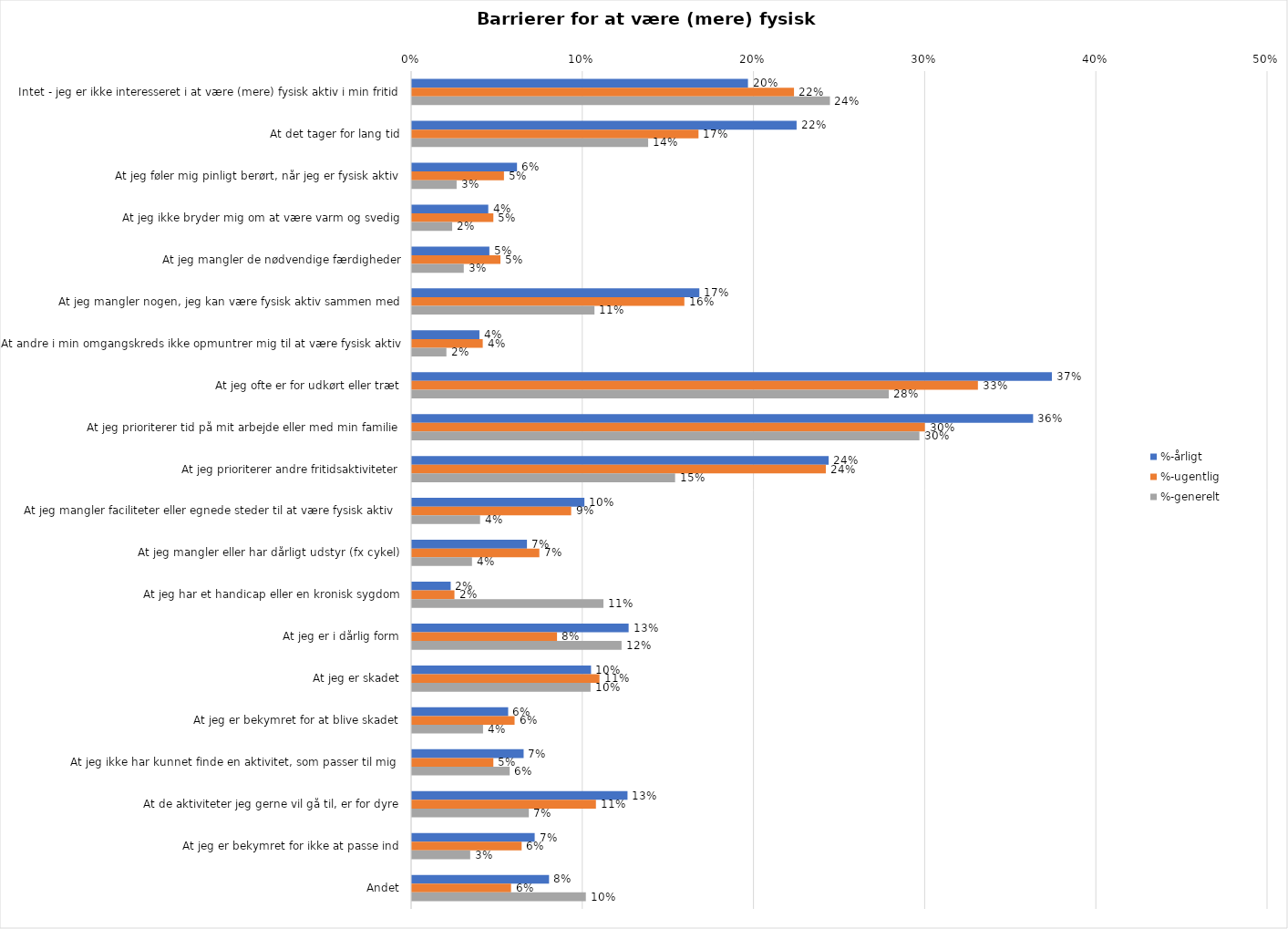
| Category | %-årligt | %-ugentlig | %-generelt |
|---|---|---|---|
| Intet - jeg er ikke interesseret i at være (mere) fysisk aktiv i min fritid | 0.196 | 0.223 | 0.244 |
| At det tager for lang tid | 0.225 | 0.167 | 0.138 |
| At jeg føler mig pinligt berørt, når jeg er fysisk aktiv | 0.061 | 0.054 | 0.026 |
| At jeg ikke bryder mig om at være varm og svedig | 0.045 | 0.048 | 0.023 |
| At jeg mangler de nødvendige færdigheder | 0.045 | 0.052 | 0.03 |
| At jeg mangler nogen, jeg kan være fysisk aktiv sammen med | 0.168 | 0.159 | 0.107 |
| At andre i min omgangskreds ikke opmuntrer mig til at være fysisk aktiv | 0.039 | 0.041 | 0.02 |
| At jeg ofte er for udkørt eller træt | 0.374 | 0.331 | 0.279 |
| At jeg prioriterer tid på mit arbejde eller med min familie | 0.363 | 0.3 | 0.296 |
| At jeg prioriterer andre fritidsaktiviteter | 0.243 | 0.242 | 0.154 |
| At jeg mangler faciliteter eller egnede steder til at være fysisk aktiv  | 0.101 | 0.093 | 0.04 |
| At jeg mangler eller har dårligt udstyr (fx cykel) | 0.067 | 0.074 | 0.035 |
| At jeg har et handicap eller en kronisk sygdom | 0.023 | 0.025 | 0.112 |
| At jeg er i dårlig form | 0.127 | 0.085 | 0.122 |
| At jeg er skadet | 0.105 | 0.11 | 0.104 |
| At jeg er bekymret for at blive skadet | 0.056 | 0.06 | 0.041 |
| At jeg ikke har kunnet finde en aktivitet, som passer til mig  | 0.065 | 0.048 | 0.057 |
| At de aktiviteter jeg gerne vil gå til, er for dyre | 0.126 | 0.107 | 0.068 |
| At jeg er bekymret for ikke at passe ind | 0.072 | 0.064 | 0.034 |
| Andet | 0.08 | 0.058 | 0.102 |